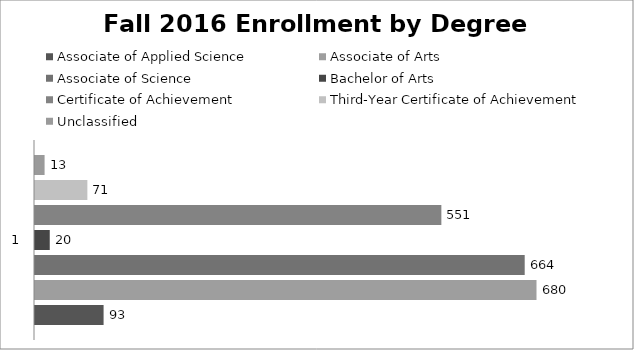
| Category | Associate of Applied Science | Associate of Arts | Associate of Science | Bachelor of Arts | Certificate of Achievement | Third-Year Certificate of Achievement | Unclassified |
|---|---|---|---|---|---|---|---|
| 0 | 93 | 680 | 664 | 20 | 551 | 71 | 13 |